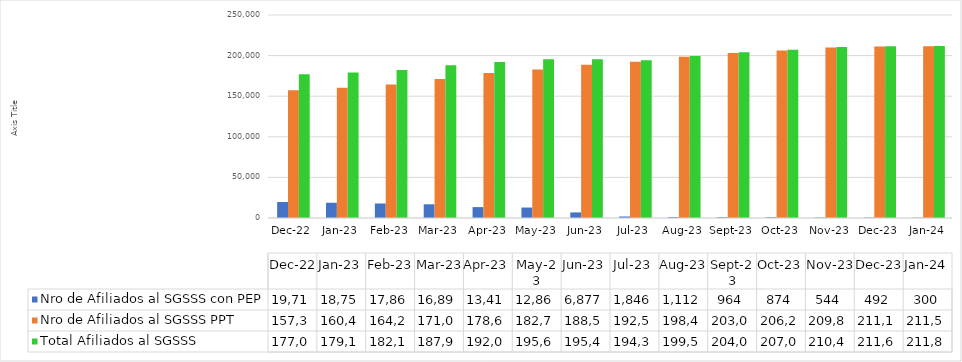
| Category | Nro de Afiliados al SGSSS con PEP | Nro de Afiliados al SGSSS PPT | Total Afiliados al SGSSS |
|---|---|---|---|
| 2022-12-01 | 19713 | 157372 | 177085 |
| 2023-01-01 | 18753 | 160416 | 179169 |
| 2023-02-01 | 17862 | 164261 | 182123 |
| 2023-03-01 | 16894 | 171077 | 187971 |
| 2023-04-01 | 13411 | 178625 | 192036 |
| 2023-05-01 | 12865 | 182754 | 195619 |
| 2023-06-01 | 6877 | 188578 | 195455 |
| 2023-07-01 | 1846 | 192533 | 194379 |
| 2023-08-01 | 1112 | 198485 | 199597 |
| 2023-09-01 | 964 | 203073 | 204037 |
| 2023-10-01 | 874 | 206201 | 207075 |
| 2023-11-01 | 544 | 209898 | 210442 |
| 2023-12-01 | 492 | 211175 | 211667 |
| 2024-01-01 | 300 | 211578 | 211878 |